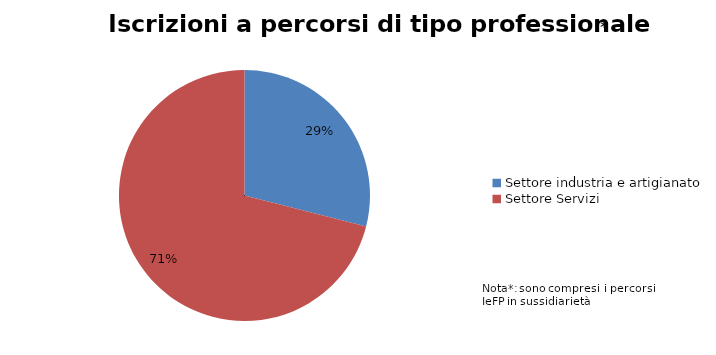
| Category | Series 0 |
|---|---|
| Settore industria e artigianato | 2136 |
| Settore Servizi | 5238 |